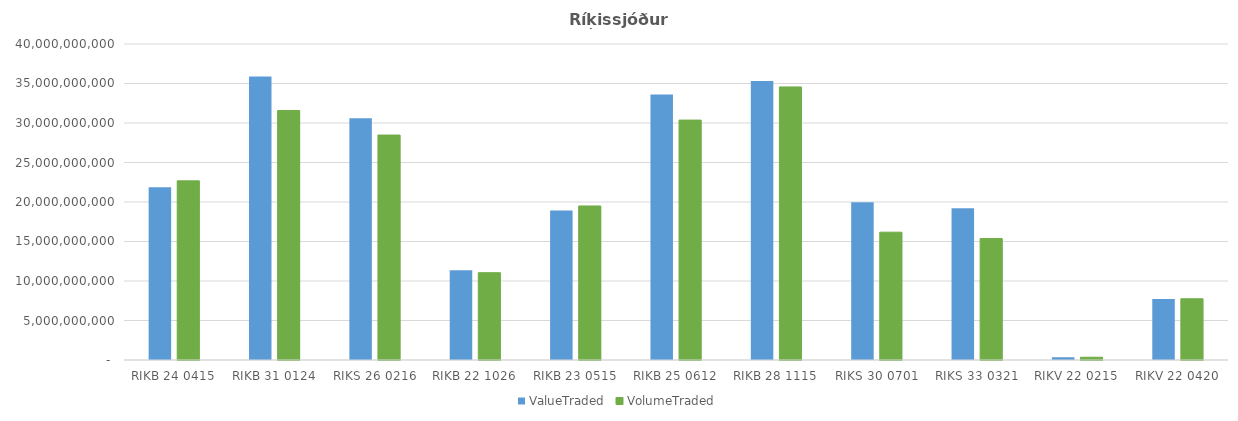
| Category | ValueTraded | VolumeTraded |
|---|---|---|
| RIKB 24 0415 | 21855590519 | 22678920000 |
| RIKB 31 0124 | 35884666247 | 31578190000 |
| RIKS 26 0216 | 30602761421.508 | 28474648300 |
| RIKB 22 1026 | 11354229559.464 | 11050422612 |
| RIKB 23 0515 | 18929891891.372 | 19498744080 |
| RIKB 25 0612 | 33621726619.895 | 30367925518 |
| RIKB 28 1115 | 35307875154.386 | 34564109165 |
| RIKS 30 0701 | 19978848689.7 | 16178327000 |
| RIKS 33 0321 | 19215076625.556 | 15368827333 |
| RIKV 22 0215 | 349574000 | 350000000 |
| RIKV 22 0420 | 7717921000 | 7750000000 |